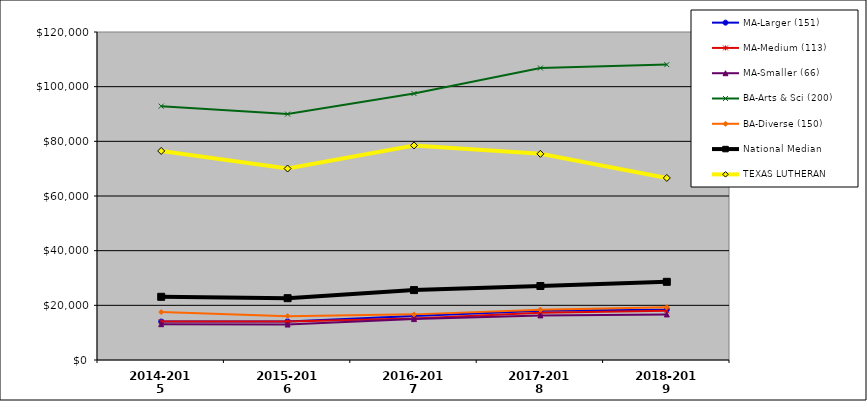
| Category | MA-Larger (151) | MA-Medium (113) | MA-Smaller (66) | BA-Arts & Sci (200) | BA-Diverse (150) | National Median |  TEXAS LUTHERAN  |
|---|---|---|---|---|---|---|---|
| 2014-2015 | 14062.049 | 14044.005 | 13098.816 | 92866.188 | 17538.98 | 23117.708 | 76478.341 |
| 2015-2016 | 14116.94 | 14056.01 | 12975.257 | 89969.444 | 16049.084 | 22619.893 | 70047.888 |
| 2016-2017 | 16078.234 | 15150.482 | 14970.298 | 97485.483 | 16692.24 | 25581.053 | 78508.712 |
| 2017-2018 | 18019.379 | 17312.686 | 16325.434 | 106838.148 | 18366.508 | 27067.87 | 75423 |
| 2018-2019 | 18396.133 | 18033.993 | 16678.197 | 108064.18 | 19308.174 | 28604.166 | 66606.85 |